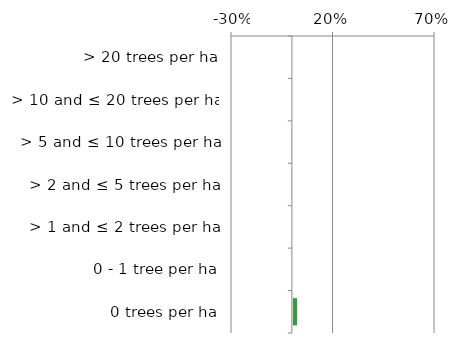
| Category | Near native & fragments |
|---|---|
| 0 trees per ha | 0.023 |
| 0 - 1 tree per ha | 0 |
| > 1 and ≤ 2 trees per ha | 0 |
| > 2 and ≤ 5 trees per ha | 0 |
| > 5 and ≤ 10 trees per ha | 0 |
| > 10 and ≤ 20 trees per ha | 0 |
| > 20 trees per ha | 0 |